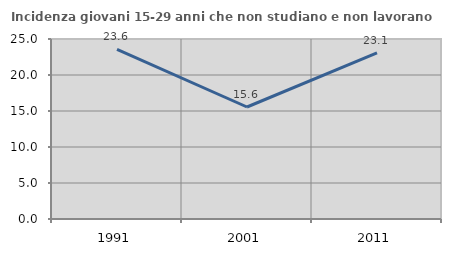
| Category | Incidenza giovani 15-29 anni che non studiano e non lavorano  |
|---|---|
| 1991.0 | 23.551 |
| 2001.0 | 15.556 |
| 2011.0 | 23.077 |